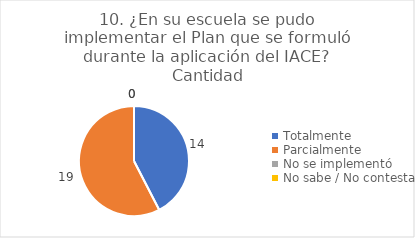
| Category | 10. ¿En su escuela se pudo implementar el Plan que se formuló durante la aplicación del IACE? |
|---|---|
| Totalmente  | 0.424 |
| Parcialmente  | 0.576 |
| No se implementó  | 0 |
| No sabe / No contesta | 0 |